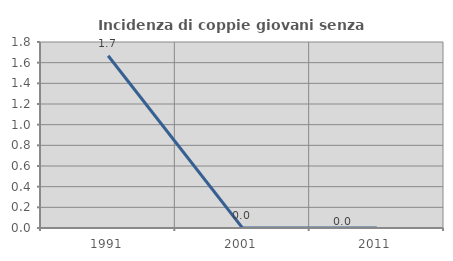
| Category | Incidenza di coppie giovani senza figli |
|---|---|
| 1991.0 | 1.667 |
| 2001.0 | 0 |
| 2011.0 | 0 |